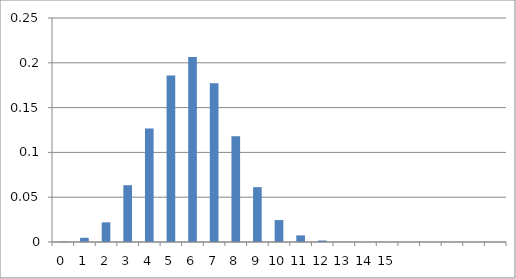
| Category | Series 0 |
|---|---|
| 0 | 0 |
| 1 | 0.005 |
| 2 | 0.022 |
| 3 | 0.063 |
| 4 | 0.127 |
| 5 | 0.186 |
| 6 | 0.207 |
| 7 | 0.177 |
| 8 | 0.118 |
| 9 | 0.061 |
| 10 | 0.024 |
| 11 | 0.007 |
| 12 | 0.002 |
| 13 | 0 |
| 14 | 0 |
| 15 | 0 |